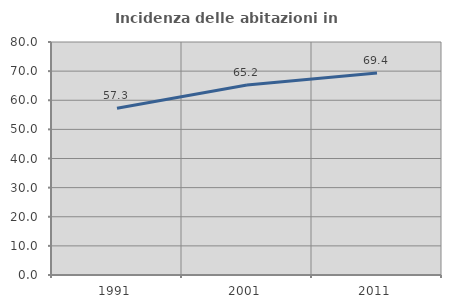
| Category | Incidenza delle abitazioni in proprietà  |
|---|---|
| 1991.0 | 57.252 |
| 2001.0 | 65.241 |
| 2011.0 | 69.39 |